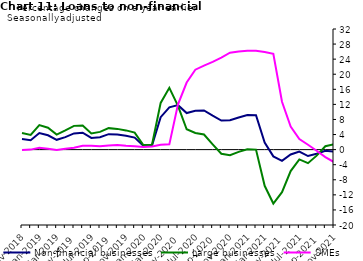
| Category | zero | Non-financial businesses | Large businesses | SMEs |
|---|---|---|---|---|
| Nov-2018 | 0 | 2.8 | 4.4 | -0.1 |
| Dec-2018 | 0 | 2.5 | 3.9 | 0 |
| Jan-2019 | 0 | 4.4 | 6.5 | 0.5 |
| Feb-2019 | 0 | 3.8 | 5.8 | 0.2 |
| Mar-2019 | 0 | 2.6 | 4 | -0.1 |
| Apr-2019 | 0 | 3.3 | 5.1 | 0.2 |
| May-2019 | 0 | 4.3 | 6.3 | 0.5 |
| Jun-2019 | 0 | 4.5 | 6.4 | 1 |
| Jul-2019 | 0 | 3.1 | 4.3 | 1 |
| Aug-2019 | 0 | 3.3 | 4.7 | 0.9 |
| Sep-2019 | 0 | 4.1 | 5.7 | 1.1 |
| Oct-2019 | 0 | 4 | 5.5 | 1.2 |
| Nov-2019 | 0 | 3.7 | 5.1 | 1 |
| Dec-2019 | 0 | 3.2 | 4.5 | 0.9 |
| Jan-2020 | 0 | 1 | 1.2 | 0.7 |
| Feb-2020 | 0 | 1.1 | 1.3 | 0.8 |
| Mar-2020 | 0 | 8.6 | 12.4 | 1.3 |
| Apr-2020 | 0 | 11.2 | 16.4 | 1.4 |
| May-2020 | 0 | 11.8 | 11.6 | 12 |
| Jun-2020 | 0 | 9.7 | 5.4 | 17.8 |
| Jul-2020 | 0 | 10.3 | 4.4 | 21.2 |
| Aug-2020 | 0 | 10.4 | 4 | 22.3 |
| Sep-2020 | 0 | 9 | 1.4 | 23.3 |
| Oct-2020 | 0 | 7.7 | -1.1 | 24.4 |
| Nov-2020 | 0 | 7.8 | -1.5 | 25.7 |
| Dec-2020 | 0 | 8.5 | -0.6 | 26 |
| Jan-2021 | 0 | 9.2 | 0.1 | 26.2 |
| Feb-2021 | 0 | 9.1 | 0 | 26.2 |
| Mar-2021 | 0 | 1.9 | -9.6 | 25.9 |
| Apr-2021 | 0 | -1.8 | -14.3 | 25.4 |
| May-2021 | 0 | -3 | -11.3 | 12.7 |
| Jun-2021 | 0 | -1.3 | -5.7 | 6.1 |
| Jul-2021 | 0 | -0.5 | -2.6 | 2.8 |
| Aug-2021 | 0 | -1.7 | -3.6 | 1.3 |
| Sep-2021 | 0 | -1.1 | -1.6 | -0.3 |
| Oct-2021 | 0 | -0.3 | 0.9 | -2 |
| Nov-2021 | 0 | -0.5 | 1.4 | -3.3 |